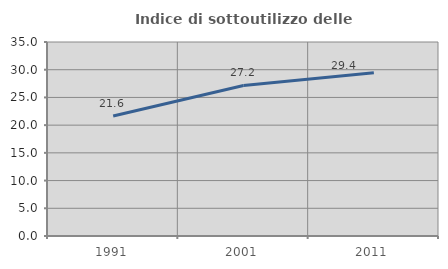
| Category | Indice di sottoutilizzo delle abitazioni  |
|---|---|
| 1991.0 | 21.64 |
| 2001.0 | 27.157 |
| 2011.0 | 29.431 |